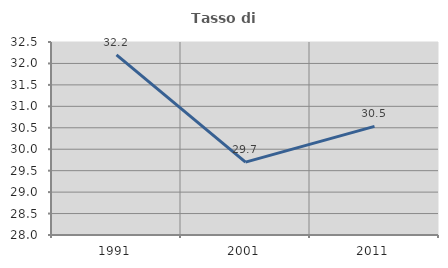
| Category | Tasso di occupazione   |
|---|---|
| 1991.0 | 32.199 |
| 2001.0 | 29.698 |
| 2011.0 | 30.533 |